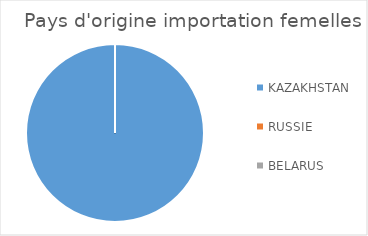
| Category | Series 0 |
|---|---|
| KAZAKHSTAN | 1 |
| RUSSIE | 0 |
| BELARUS | 0 |